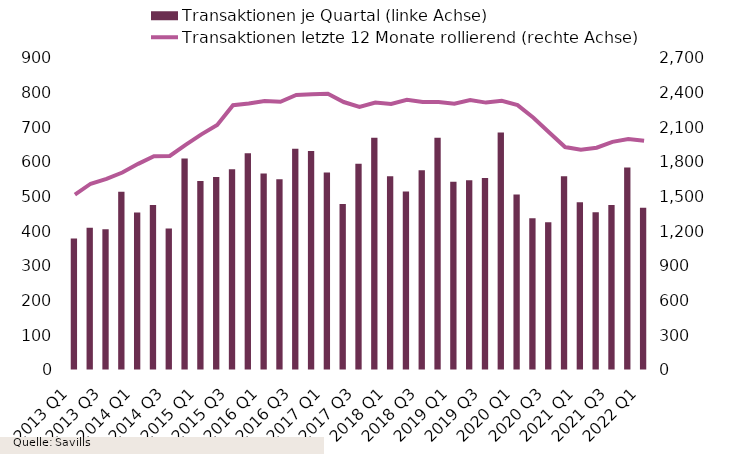
| Category | Transaktionen je Quartal (linke Achse) |
|---|---|
| 2013 Q1 | 379 |
| 2013 Q2 | 410 |
| 2013 Q3 | 406 |
| 2013 Q4 | 514 |
| 2014 Q1 | 454 |
| 2014 Q2 | 476 |
| 2014 Q3 | 408 |
| 2014 Q4 | 610 |
| 2015 Q1 | 545 |
| 2015 Q2 | 557 |
| 2015 Q3 | 579 |
| 2015 Q4 | 625 |
| 2016 Q1 | 567 |
| 2016 Q2 | 550 |
| 2016 Q3 | 638 |
| 2016 Q4 | 632 |
| 2017 Q1 | 570 |
| 2017 Q2 | 479 |
| 2017 Q3 | 595 |
| 2017 Q4 | 670 |
| 2018 Q1 | 559 |
| 2018 Q2 | 515 |
| 2018 Q3 | 576 |
| 2018 Q4 | 670 |
| 2019 Q1 | 543 |
| 2019 Q2 | 547 |
| 2019 Q3 | 554 |
| 2019 Q4 | 685 |
| 2020 Q1 | 506 |
| 2020 Q2 | 438 |
| 2020 Q3 | 426 |
| 2020 Q4 | 559 |
| 2021 Q1 | 484 |
| 2021 Q2 | 455 |
| 2021 Q3 | 476 |
| 2021 Q4 | 584 |
| 2022 Q1 | 468 |